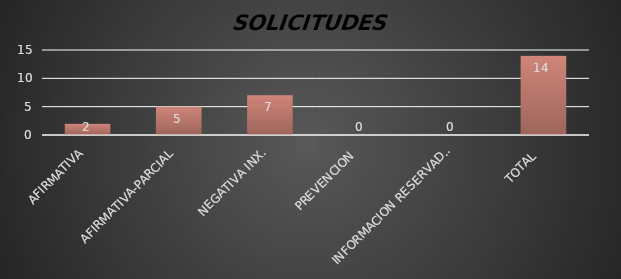
| Category | Series 1 |
|---|---|
| AFIRMATIVA | 2 |
| AFIRMATIVA-PARCIAL | 5 |
| NEGATIVA INX. | 7 |
| PREVENCION  | 0 |
| INFORMACION RESERVADA | 0 |
| TOTAL  | 14 |